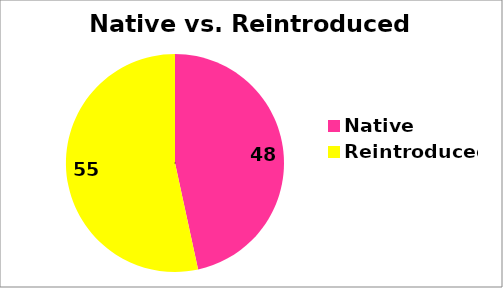
| Category | Series 0 |
|---|---|
| Native | 48 |
| Reintroduced | 55 |